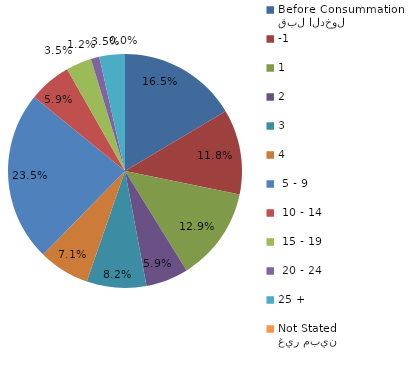
| Category | Series 0 |
|---|---|
| قبل الدخول
Before Consummation | 16.471 |
| -1 | 11.765 |
| 1 | 12.941 |
| 2 | 5.882 |
| 3 | 8.235 |
| 4 | 7.059 |
|  5 - 9 | 23.529 |
|  10 - 14 | 5.882 |
|  15 - 19 | 3.529 |
|  20 - 24 | 1.176 |
| 25 + | 3.529 |
| غير مبين
Not Stated | 0 |